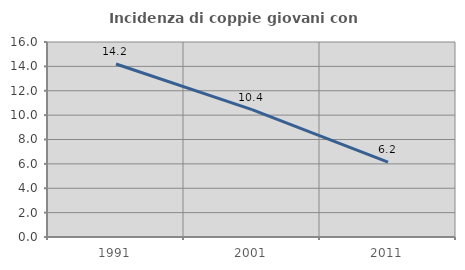
| Category | Incidenza di coppie giovani con figli |
|---|---|
| 1991.0 | 14.193 |
| 2001.0 | 10.448 |
| 2011.0 | 6.151 |